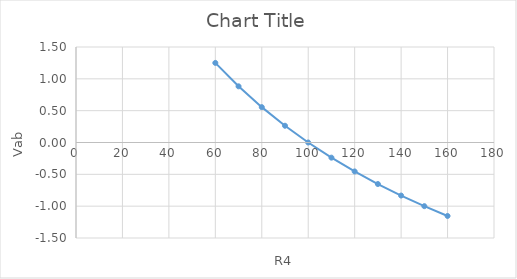
| Category | Series 0 |
|---|---|
| 60.0 | 1.25 |
| 70.0 | 0.882 |
| 80.0 | 0.556 |
| 90.0 | 0.263 |
| 100.0 | 0 |
| 110.0 | -0.238 |
| 120.0 | -0.455 |
| 130.0 | -0.652 |
| 140.0 | -0.833 |
| 150.0 | -1 |
| 160.0 | -1.154 |